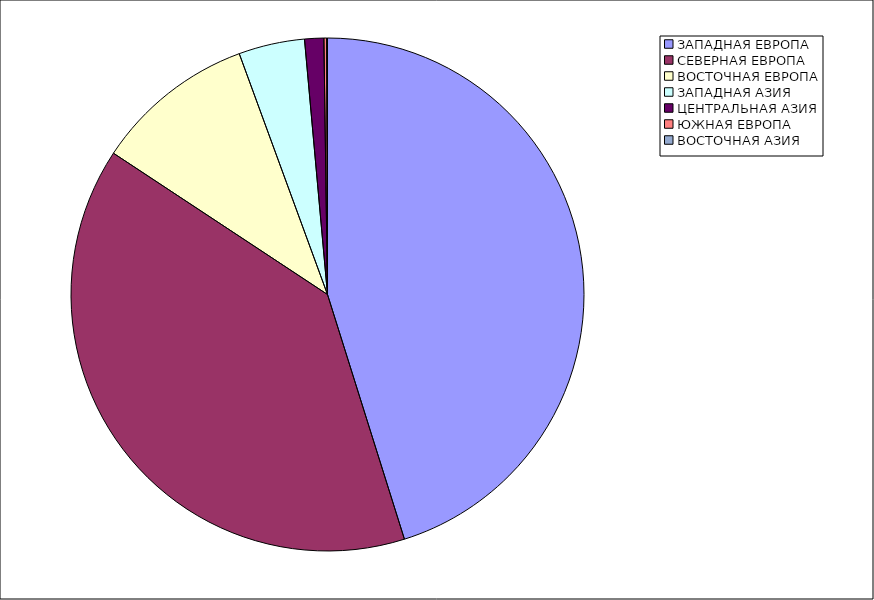
| Category | Оборот |
|---|---|
| ЗАПАДНАЯ ЕВРОПА | 45.151 |
| СЕВЕРНАЯ ЕВРОПА | 39.135 |
| ВОСТОЧНАЯ ЕВРОПА | 10.123 |
| ЗАПАДНАЯ АЗИЯ | 4.16 |
| ЦЕНТРАЛЬНАЯ АЗИЯ | 1.206 |
| ЮЖНАЯ ЕВРОПА | 0.174 |
| ВОСТОЧНАЯ АЗИЯ | 0.051 |